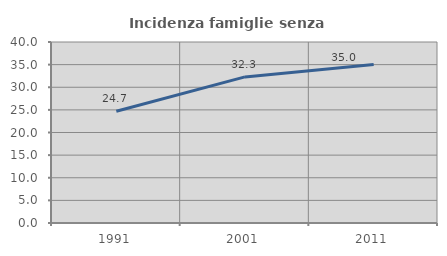
| Category | Incidenza famiglie senza nuclei |
|---|---|
| 1991.0 | 24.685 |
| 2001.0 | 32.287 |
| 2011.0 | 35.032 |